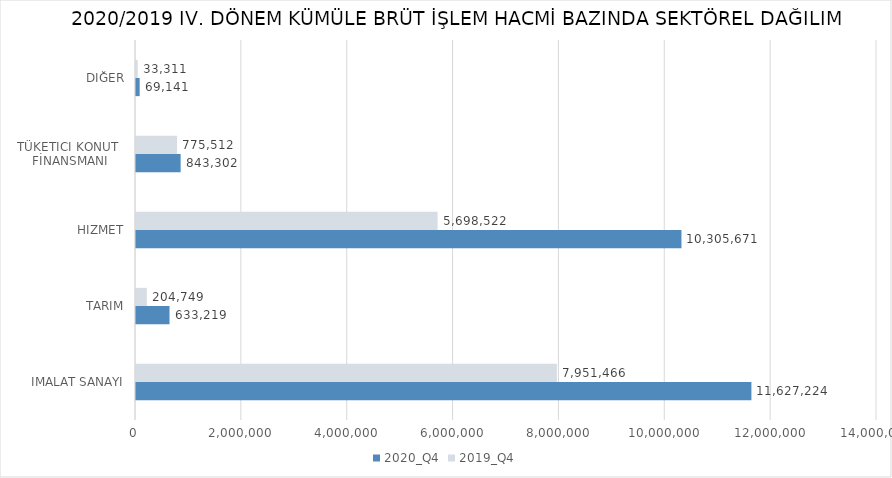
| Category | 2020_Q4 | 2019_Q4 |
|---|---|---|
| İMALAT SANAYİ | 11627224.274 | 7951466.455 |
| TARIM | 633218.575 | 204749.488 |
| HİZMET | 10305671.197 | 5698522.208 |
| TÜKETİCİ KONUT 
FİNANSMANI | 843302 | 775512 |
| DİĞER | 69141.38 | 33311.15 |